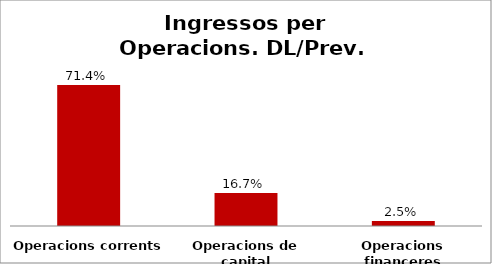
| Category | Series 0 |
|---|---|
| Operacions corrents | 0.714 |
| Operacions de capital | 0.167 |
| Operacions financeres | 0.025 |